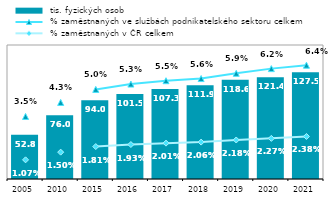
| Category |  tis. fyzických osob |
|---|---|
| 2005.0 | 52.808 |
| 2010.0 | 76.014 |
| 2015.0 | 94.048 |
| 2016.0 | 101.515 |
| 2017.0 | 107.325 |
| 2018.0 | 111.859 |
| 2019.0 | 118.573 |
| 2020.0 | 121.393 |
| 2021.0 | 127.528 |